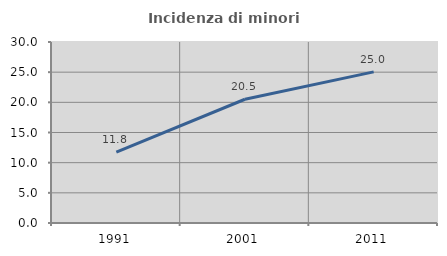
| Category | Incidenza di minori stranieri |
|---|---|
| 1991.0 | 11.765 |
| 2001.0 | 20.513 |
| 2011.0 | 25.05 |